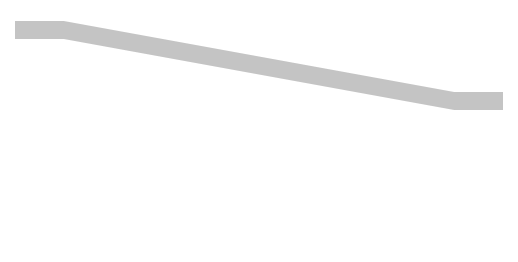
| Category | S1 | S2 | S3 |
|---|---|---|---|
| 0.0 | 50 | 150 | 1730 |
| 10.0 | 50 | 150 | 1730 |
| 90.0 | 640 | 150 | 1140 |
| 100.0 | 640 | 150 | 1140 |